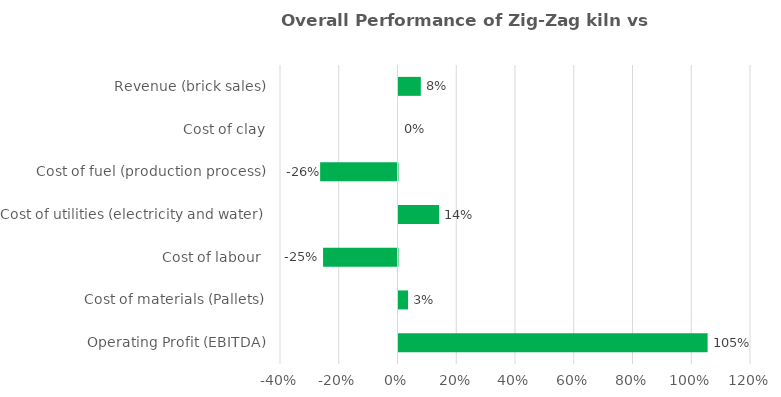
| Category | Series 0 |
|---|---|
| Operating Profit (EBITDA) | 1.052 |
| Cost of materials (Pallets) | 0.032 |
| Cost of labour  | -0.253 |
| Cost of utilities (electricity and water) | 0.138 |
| Cost of fuel (production process) | -0.263 |
| Cost of clay | 0 |
| Revenue (brick sales) | 0.076 |